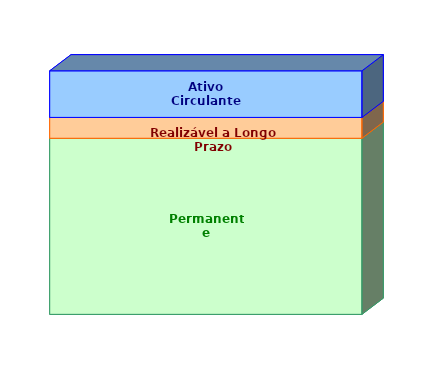
| Category | Permanente | Realizável a Longo Prazo | Ativo Circulante |
|---|---|---|---|
| 0 | 0.723 | 0.086 | 0.191 |